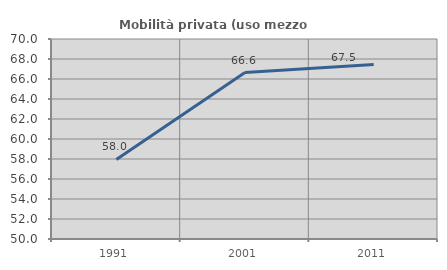
| Category | Mobilità privata (uso mezzo privato) |
|---|---|
| 1991.0 | 57.955 |
| 2001.0 | 66.647 |
| 2011.0 | 67.454 |